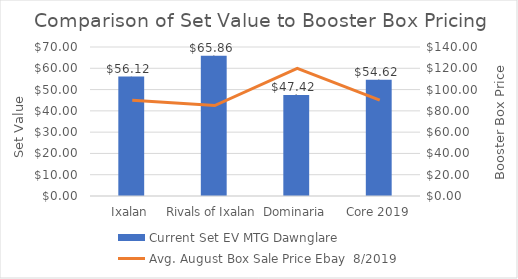
| Category | Current Set EV MTG Dawnglare  |
|---|---|
| Ixalan | 56.12 |
| Rivals of Ixalan | 65.86 |
| Dominaria | 47.42 |
| Core 2019 | 54.62 |